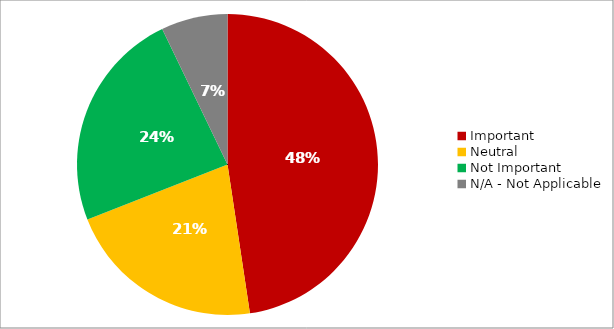
| Category | Responses |
|---|---|
| Important | 0.476 |
| Neutral | 0.214 |
| Not Important | 0.238 |
| N/A - Not Applicable | 0.071 |